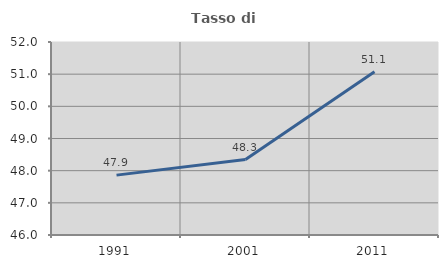
| Category | Tasso di occupazione   |
|---|---|
| 1991.0 | 47.861 |
| 2001.0 | 48.345 |
| 2011.0 | 51.079 |